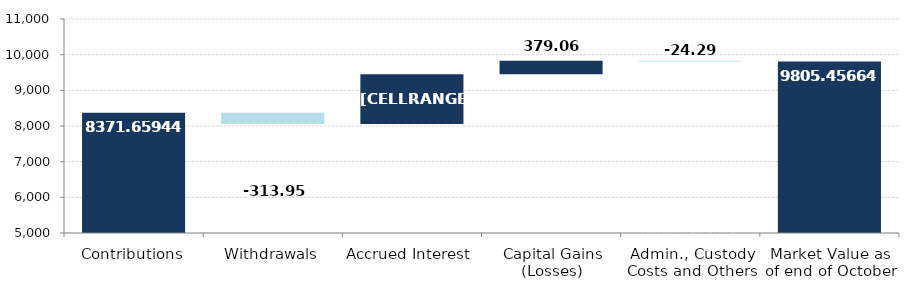
| Category | Valor | Cambio absoluto |
|---|---|---|
| Contributions | 8371.659 | 0 |
| Withdrawals | 8057.713 | 313.947 |
| Accrued Interest  | 8057.713 | 1392.981 |
| Capital Gains (Losses) | 9450.694 | 379.057 |
| Admin., Custody Costs and Others | 9805.457 | 24.294 |
| Market Value as of end of October | 9805.457 | 0 |